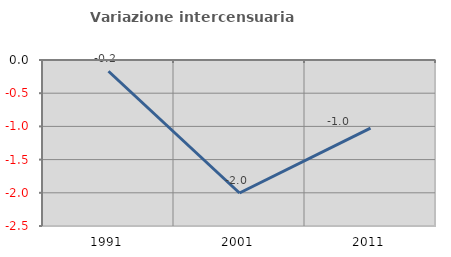
| Category | Variazione intercensuaria annua |
|---|---|
| 1991.0 | -0.17 |
| 2001.0 | -2.003 |
| 2011.0 | -1.026 |